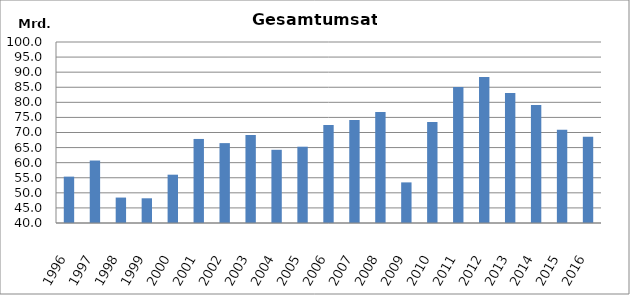
| Category | Series 0 |
|---|---|
| 1996.0 | 55371956 |
| 1997.0 | 60710454 |
| 1998.0 | 48430705 |
| 1999.0 | 48190293 |
| 2000.0 | 56014702 |
| 2001.0 | 67861795 |
| 2002.0 | 66481294 |
| 2003.0 | 69161973 |
| 2004.0 | 64266307 |
| 2005.0 | 65293897 |
| 2006.0 | 72514648 |
| 2007.0 | 74176770 |
| 2008.0 | 76788139 |
| 2009.0 | 53462495 |
| 2010.0 | 73497409.496 |
| 2011.0 | 85064473 |
| 2012.0 | 88419481 |
| 2013.0 | 83060160.429 |
| 2014.0 | 79153644.015 |
| 2015.0 | 70914314 |
| 2016.0 | 68567351 |